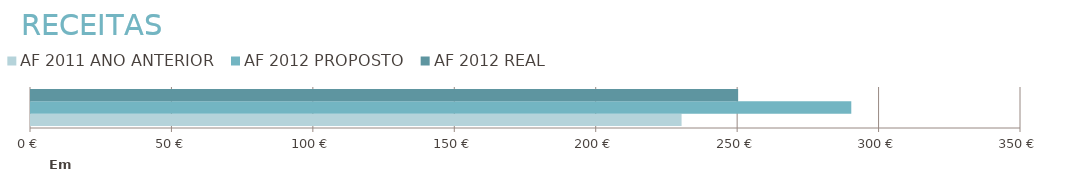
| Category | AF 2011 | AF 2012 |
|---|---|---|
| 0 | 230000 | 250000 |